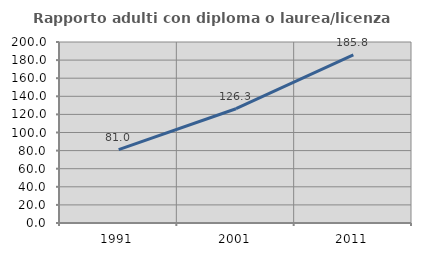
| Category | Rapporto adulti con diploma o laurea/licenza media  |
|---|---|
| 1991.0 | 81.026 |
| 2001.0 | 126.267 |
| 2011.0 | 185.782 |